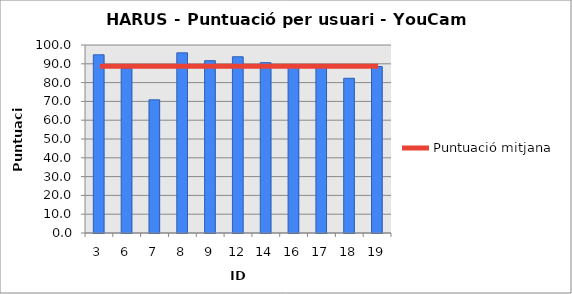
| Category | HARUS |
|---|---|
| 3.0 | 94.792 |
| 6.0 | 87.5 |
| 7.0 | 70.833 |
| 8.0 | 95.833 |
| 9.0 | 91.667 |
| 12.0 | 93.75 |
| 14.0 | 90.625 |
| 16.0 | 89.583 |
| 17.0 | 89.583 |
| 18.0 | 82.292 |
| 19.0 | 88.542 |